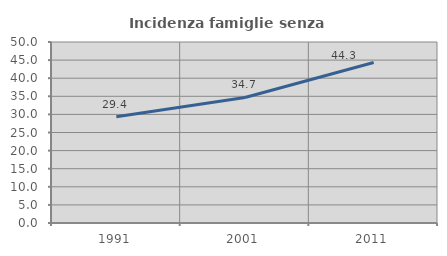
| Category | Incidenza famiglie senza nuclei |
|---|---|
| 1991.0 | 29.368 |
| 2001.0 | 34.686 |
| 2011.0 | 44.33 |